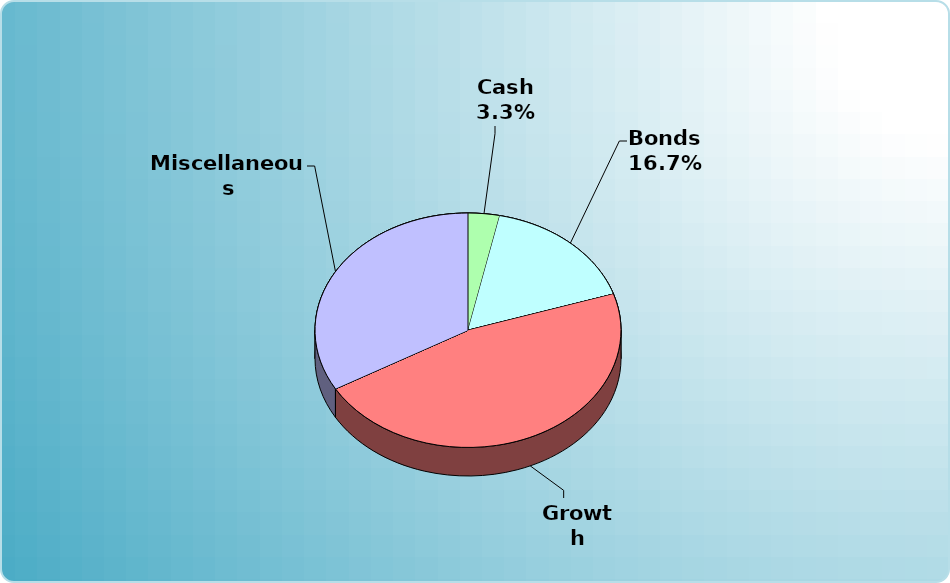
| Category | Series 0 |
|---|---|
| Cash | 5000 |
| Bonds | 25000 |
| Muni Bond | 0 |
| Hybrid bond | 0 |
| Value | 0 |
| Growth | 70000 |
| Small-Cap | 0 |
| Tangibles | 0 |
| International | 0 |
| Personal Property | 0 |
| Miscellaneous | 50000 |